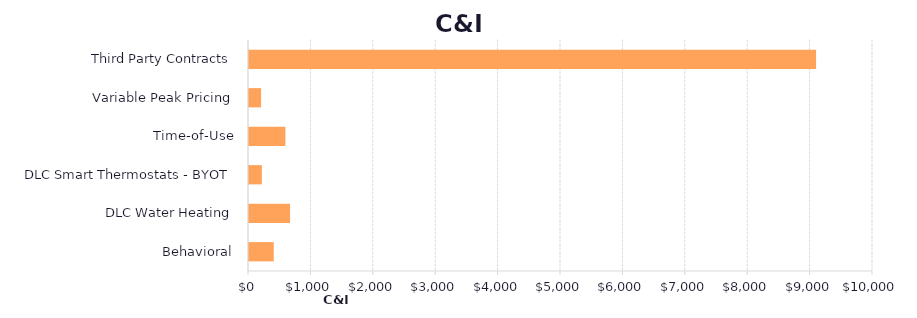
| Category | Series 1 |
|---|---|
| Behavioral | 396.193 |
| DLC Water Heating | 658.181 |
| DLC Smart Thermostats - BYOT | 206.155 |
| Time-of-Use | 583.228 |
| Variable Peak Pricing | 193.419 |
| Third Party Contracts | 9087.451 |